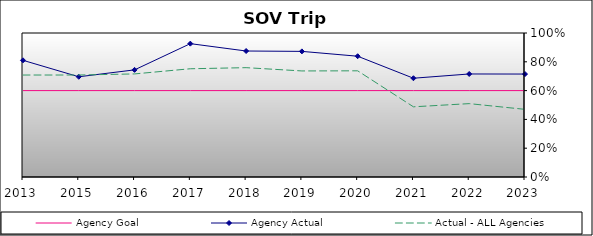
| Category | Agency Goal | Agency Actual | Actual - ALL Agencies |
|---|---|---|---|
| 2013.0 | 0.6 | 0.81 | 0.708 |
| 2015.0 | 0.6 | 0.696 | 0.708 |
| 2016.0 | 0.6 | 0.744 | 0.716 |
| 2017.0 | 0.6 | 0.926 | 0.752 |
| 2018.0 | 0.6 | 0.875 | 0.759 |
| 2019.0 | 0.6 | 0.872 | 0.736 |
| 2020.0 | 0.6 | 0.839 | 0.737 |
| 2021.0 | 0.6 | 0.686 | 0.487 |
| 2022.0 | 0.6 | 0.715 | 0.509 |
| 2023.0 | 0.6 | 0.715 | 0.47 |